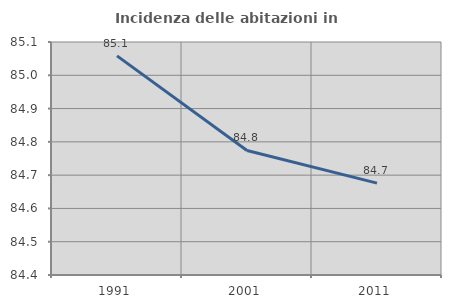
| Category | Incidenza delle abitazioni in proprietà  |
|---|---|
| 1991.0 | 85.058 |
| 2001.0 | 84.774 |
| 2011.0 | 84.676 |